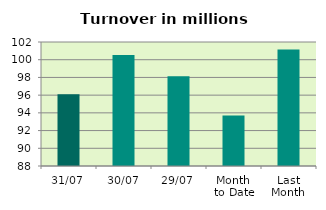
| Category | Series 0 |
|---|---|
| 31/07 | 96.108 |
| 30/07 | 100.533 |
| 29/07 | 98.132 |
| Month 
to Date | 93.691 |
| Last
Month | 101.166 |